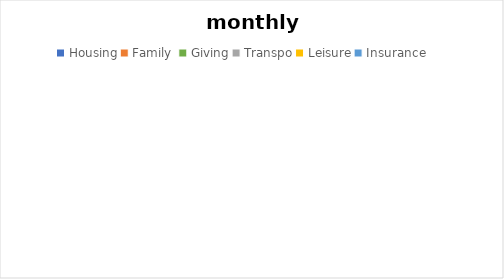
| Category | Series 0 |
|---|---|
| Housing | 0 |
| Family  | 0 |
| Giving | 0 |
| Transpo | 0 |
| Leisure | 0 |
| Insurance | 0 |